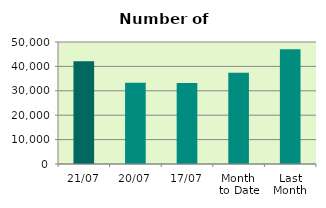
| Category | Series 0 |
|---|---|
| 21/07 | 42160 |
| 20/07 | 33330 |
| 17/07 | 33244 |
| Month 
to Date | 37383.067 |
| Last
Month | 46980.273 |